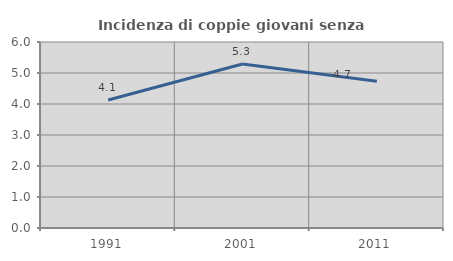
| Category | Incidenza di coppie giovani senza figli |
|---|---|
| 1991.0 | 4.127 |
| 2001.0 | 5.288 |
| 2011.0 | 4.734 |